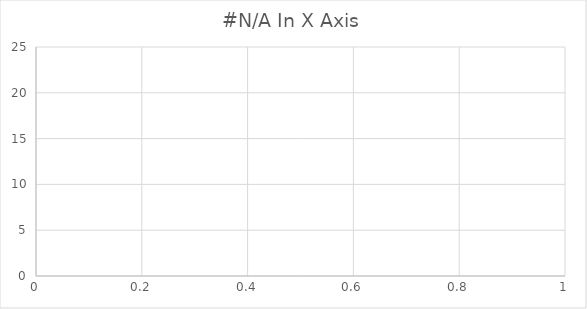
| Category | Y |
|---|---|
| #N/A | 20 |
| #N/A | 18 |
| #N/A | 16 |
| #N/A | 14 |
| #N/A | 12 |
| #N/A | 10 |
| #N/A | 8 |
| #N/A | 6 |
| #N/A | 4 |
| #N/A | 2 |
| #N/A | 0 |